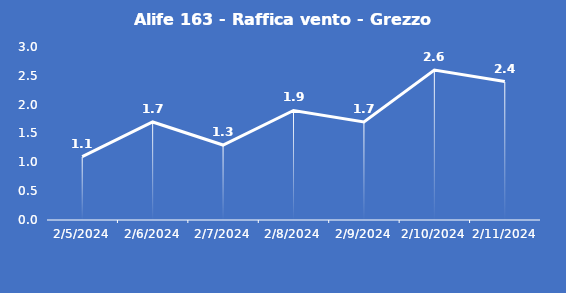
| Category | Alife 163 - Raffica vento - Grezzo (m/s) |
|---|---|
| 2/5/24 | 1.1 |
| 2/6/24 | 1.7 |
| 2/7/24 | 1.3 |
| 2/8/24 | 1.9 |
| 2/9/24 | 1.7 |
| 2/10/24 | 2.6 |
| 2/11/24 | 2.4 |